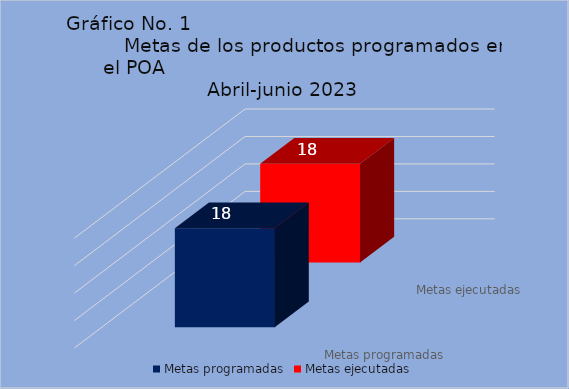
| Category | Metas programadas | Metas ejecutadas |
|---|---|---|
| 0 | 18 | 18 |